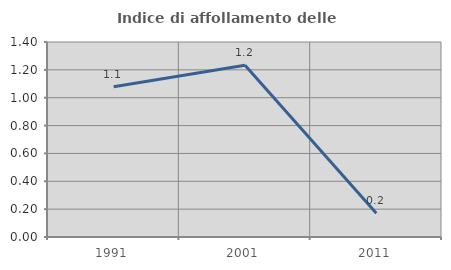
| Category | Indice di affollamento delle abitazioni  |
|---|---|
| 1991.0 | 1.078 |
| 2001.0 | 1.234 |
| 2011.0 | 0.171 |